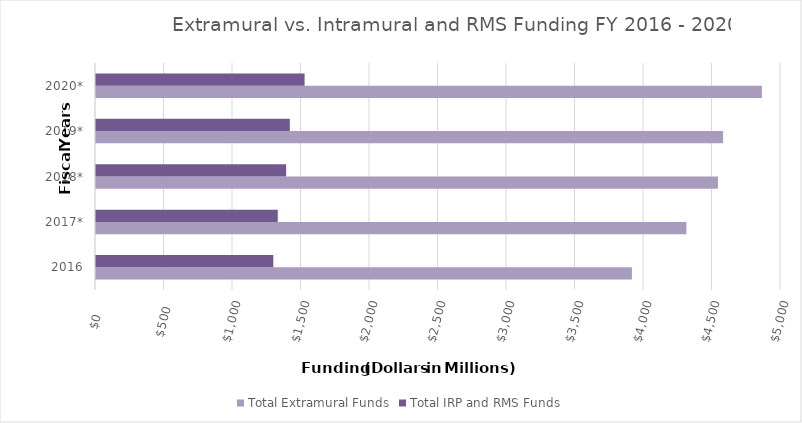
| Category | Total Extramural Funds | Total IRP and RMS Funds |
|---|---|---|
| 2016 | 3911.872 | 1294.293 |
| 2017* | 4309.659 | 1326.733 |
| 2018* | 4539.773 | 1387.911 |
| 2019* | 4577.498 | 1414.788 |
| 2020* | 4860.713 | 1522.638 |